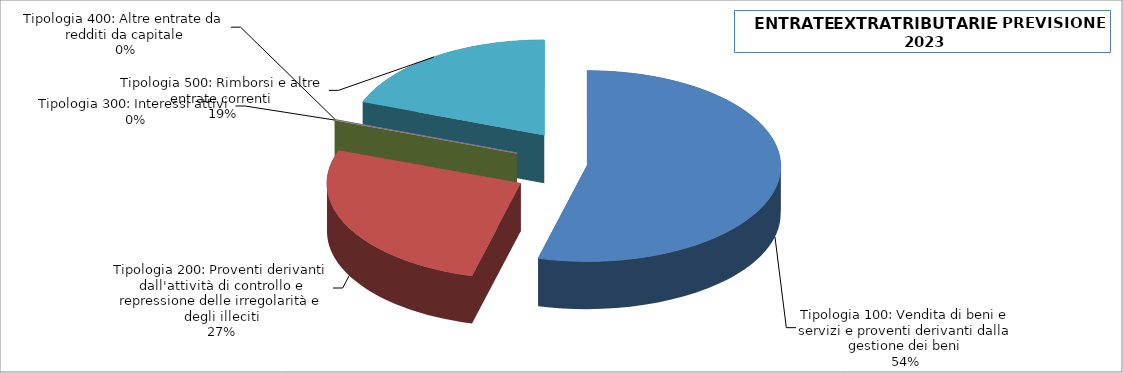
| Category | Series 0 |
|---|---|
| Tipologia 100: Vendita di beni e servizi e proventi derivanti dalla gestione dei beni | 5114407 |
| Tipologia 200: Proventi derivanti dall'attività di controllo e repressione delle irregolarità e degli illeciti | 2510000 |
| Tipologia 300: Interessi attivi | 11000 |
| Tipologia 400: Altre entrate da redditi da capitale | 0 |
| Tipologia 500: Rimborsi e altre entrate correnti | 1828076 |